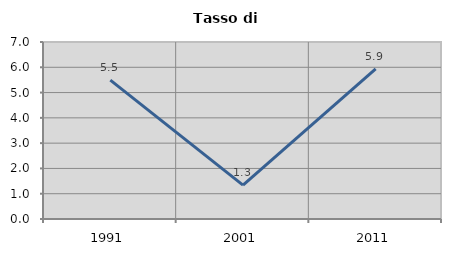
| Category | Tasso di disoccupazione   |
|---|---|
| 1991.0 | 5.49 |
| 2001.0 | 1.342 |
| 2011.0 | 5.94 |